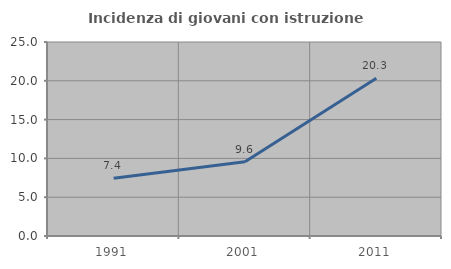
| Category | Incidenza di giovani con istruzione universitaria |
|---|---|
| 1991.0 | 7.435 |
| 2001.0 | 9.579 |
| 2011.0 | 20.328 |